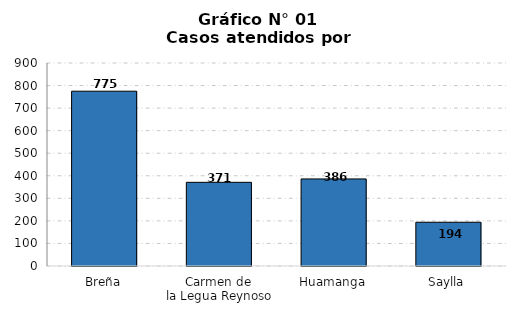
| Category | Series 0 |
|---|---|
| Breña | 775 |
| Carmen de 
la Legua Reynoso | 371 |
| Huamanga | 386 |
| Saylla | 194 |